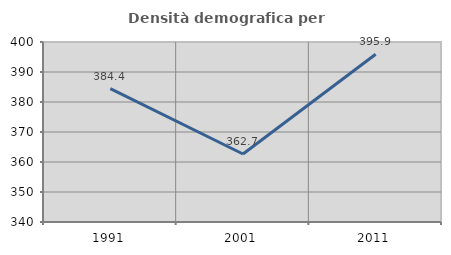
| Category | Densità demografica |
|---|---|
| 1991.0 | 384.439 |
| 2001.0 | 362.668 |
| 2011.0 | 395.898 |